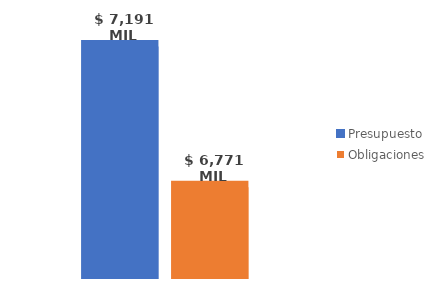
| Category | Presupuesto | Obligaciones |
|---|---|---|
| Total | 7191315711523.72 | 6770617885484.533 |